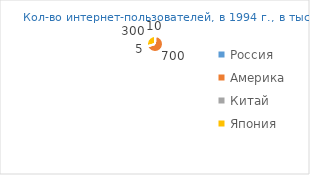
| Category | Series 0 |
|---|---|
| Россия | 10 |
| Америка | 700 |
| Китай | 5 |
| Япония | 300 |